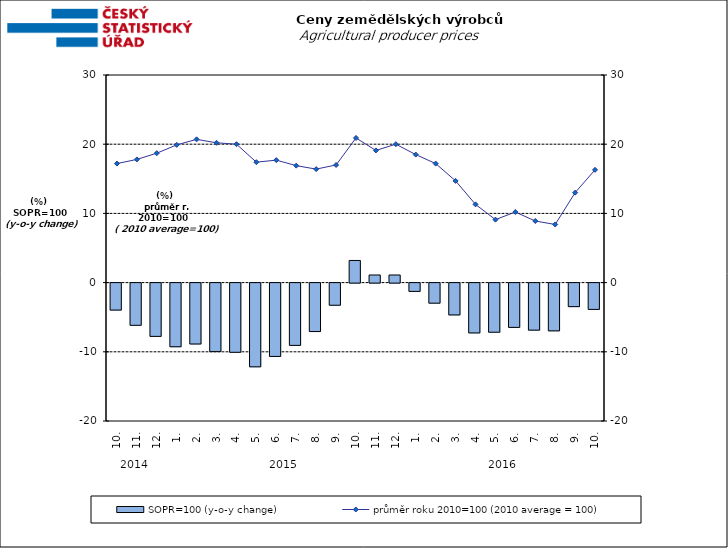
| Category | SOPR=100 (y-o-y change)   |
|---|---|
| 0 | -3.9 |
| 1 | -6.1 |
| 2 | -7.7 |
| 3 | -9.2 |
| 4 | -8.8 |
| 5 | -9.9 |
| 6 | -10 |
| 7 | -12.1 |
| 8 | -10.6 |
| 9 | -9 |
| 10 | -7 |
| 11 | -3.2 |
| 12 | 3.2 |
| 13 | 1.1 |
| 14 | 1.1 |
| 15 | -1.2 |
| 16 | -2.9 |
| 17 | -4.6 |
| 18 | -7.2 |
| 19 | -7.1 |
| 20 | -6.4 |
| 21 | -6.8 |
| 22 | -6.9 |
| 23 | -3.4 |
| 24 | -3.8 |